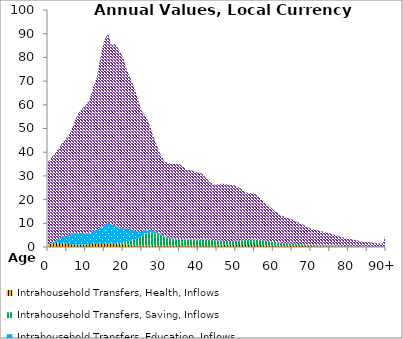
| Category | Intrahousehold Transfers, Health, Inflows | Intrahousehold Transfers, Saving, Inflows | Intrahousehold Transfers, Education, Inflows | Intrahousehold Transfers, Consumption other than health and education, Inflows |
|---|---|---|---|---|
| 0 | 1007.791 | 0 | 0 | 34872.612 |
|  | 1439.793 | 0 | 247.8 | 36191.415 |
| 2 | 1689.762 | 0 | 898.382 | 37259.124 |
| 3 | 1756.952 | 0 | 1743.852 | 38542.989 |
| 4 | 1602.476 | 0 | 2782.978 | 39862.033 |
| 5 | 1326.594 | 0 | 3605.7 | 41190.56 |
| 6 | 1093.071 | 0 | 4062.078 | 43168.246 |
| 7 | 1055.788 | 0 | 4715.643 | 46867.762 |
| 8 | 1064.827 | 0 | 4935.658 | 50257.96 |
| 9 | 1074.581 | 0 | 4866.279 | 52264.702 |
| 10 | 1041.262 | 0 | 4600.747 | 54140.727 |
| 11 | 1129.933 | 0 | 4691.136 | 56312.803 |
| 12 | 1343.104 | 0 | 5407.205 | 60387.189 |
| 13 | 1391.675 | 0 | 5933.697 | 64358.52 |
| 14 | 1403.782 | 0 | 6724.188 | 72456.226 |
| 15 | 1407.81 | 0.005 | 7713.282 | 78313.809 |
| 16 | 1470.016 | 0.533 | 8777.481 | 79710.645 |
| 17 | 1307.177 | 25.367 | 8159.899 | 75610.292 |
| 18 | 1241.986 | 256.975 | 7648.185 | 76580.617 |
| 19 | 1134.785 | 563.561 | 6095.318 | 74984.638 |
| 20 | 1169.63 | 1015.888 | 5723.171 | 72144.511 |
| 21 | 1019.835 | 1421.341 | 5356.278 | 66968.323 |
| 22 | 820.023 | 1895.841 | 4778.005 | 63702.587 |
| 23 | 649.201 | 2359.213 | 3921.021 | 60137.504 |
| 24 | 564.38 | 3078.841 | 2858.173 | 55508.826 |
| 25 | 532.866 | 3921.903 | 1901.579 | 50912.51 |
| 26 | 596.968 | 5028.495 | 1483.95 | 48223.884 |
| 27 | 622.244 | 5692.925 | 1180.521 | 44481.948 |
| 28 | 611.753 | 5363.172 | 885.349 | 40118.383 |
| 29 | 592.439 | 5006.831 | 636.665 | 36552.952 |
| 30 | 518.534 | 4532.862 | 447.733 | 33417.485 |
| 31 | 477.497 | 3868.115 | 263.162 | 31439.131 |
| 32 | 504.379 | 3405.993 | 186.394 | 31406.569 |
| 33 | 521.55 | 3045.089 | 141.034 | 31407.259 |
| 34 | 591.471 | 2687.325 | 130.202 | 31629.023 |
| 35 | 691.633 | 2547.673 | 134.415 | 31677.38 |
| 36 | 708.964 | 2485.699 | 121.944 | 30474.199 |
| 37 | 659.724 | 2525.129 | 95.108 | 29204.85 |
| 38 | 615.524 | 2594.799 | 73.706 | 29163.313 |
| 39 | 521.068 | 2639.788 | 52.971 | 28641.082 |
| 40 | 449.254 | 2640.418 | 43.917 | 28315.931 |
| 41 | 419.115 | 2724.751 | 38.947 | 27804.079 |
| 42 | 422.165 | 2650.908 | 30.835 | 26207.298 |
| 43 | 462.672 | 2580.791 | 26.385 | 24339.926 |
| 44 | 532.463 | 2395.316 | 17.412 | 23433.98 |
| 45 | 641.213 | 2202.715 | 16.523 | 23668.109 |
| 46 | 753.345 | 1992.873 | 21.05 | 23880.537 |
| 47 | 811.827 | 1742.807 | 27.844 | 24162.51 |
| 48 | 844.125 | 1664.598 | 29.246 | 23850.783 |
| 49 | 875.031 | 1686.476 | 28.18 | 23585.539 |
| 50 | 870.675 | 1817.685 | 23.822 | 23133.165 |
| 51 | 826.405 | 1973.581 | 18.223 | 22142.042 |
| 52 | 806.61 | 2055.158 | 12.972 | 20880.693 |
| 53 | 830.568 | 2115.005 | 6.959 | 19952.991 |
| 54 | 872.699 | 2162.088 | 5.214 | 19649.584 |
| 55 | 891.309 | 2328.31 | 1.711 | 19252.03 |
| 56 | 870.27 | 2323.709 | 1.304 | 18268.348 |
| 57 | 810.906 | 2166.566 | 1.326 | 17108.702 |
| 58 | 740.232 | 1935.827 | 1.204 | 15838.908 |
| 59 | 672.49 | 1726.654 | 1.076 | 14646.166 |
| 60 | 626.329 | 1560.673 | 0.98 | 13550.048 |
| 61 | 586.383 | 1363.404 | 0.871 | 12542.164 |
| 62 | 551.241 | 1182.406 | 0.771 | 11636.597 |
| 63 | 544.14 | 1074.177 | 0.672 | 11122.59 |
| 64 | 534.216 | 997.594 | 0.588 | 10608.629 |
| 65 | 523.012 | 910.095 | 0.533 | 10187.768 |
| 66 | 478.578 | 842.995 | 0.52 | 9534.948 |
| 67 | 449.914 | 786.454 | 0.514 | 8928.992 |
| 68 | 416.968 | 709.363 | 0.399 | 8219.809 |
| 69 | 385.798 | 621.019 | 0 | 7534.523 |
| 70 | 359.558 | 528.335 | 0 | 6919.273 |
| 71 | 337.298 | 416.861 | 0 | 6466.176 |
| 72 | 332.48 | 392.928 | 0 | 6222.935 |
| 73 | 324.172 | 373.477 | 0 | 5912.033 |
| 74 | 307.257 | 354.038 | 0 | 5487.218 |
| 75 | 293.728 | 337.096 | 0 | 5174.138 |
| 76 | 273.404 | 315.777 | 0 | 4801.688 |
| 77 | 240.521 | 286.932 | 0 | 4287.375 |
| 78 | 208.912 | 250.383 | 0 | 3835.987 |
| 79 | 180.247 | 213.957 | 0 | 3394.503 |
| 80 | 164.384 | 183.662 | 0 | 3139.909 |
| 81 | 149.97 | 155.994 | 0 | 2893.257 |
| 82 | 134.429 | 132.146 | 0 | 2628.577 |
| 83 | 115.977 | 106.258 | 0 | 2291.757 |
| 84 | 98.429 | 83.15 | 0 | 1961.106 |
| 85 | 92.206 | 71.522 | 0 | 1852.658 |
| 86 | 87.174 | 60.34 | 0 | 1759.363 |
| 87 | 79.369 | 48.188 | 0 | 1606.396 |
| 88 | 71.229 | 37.818 | 0 | 1447.882 |
| 89 | 60.811 | 27.679 | 0 | 1240.252 |
| 90+ | 259.302 | 92.149 | 0 | 5248.345 |